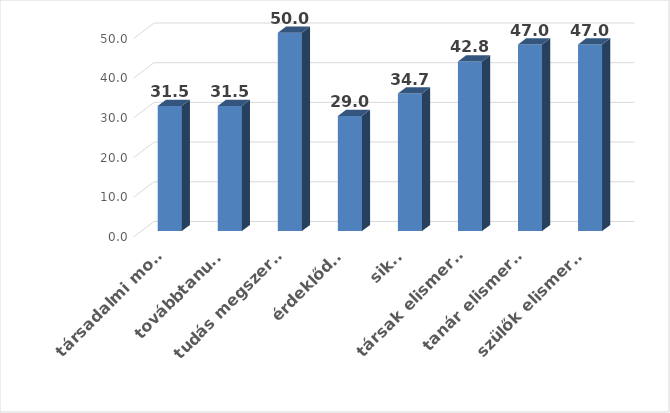
| Category | Series 0 |
|---|---|
| társadalmi motívumok, értékek | 31.5 |
| továbbtanulás | 31.5 |
| tudás megszerzése | 50 |
| érdeklődés | 29 |
| siker | 34.667 |
| társak elismerése | 42.75 |
| tanár elismerése | 47 |
| szülők elismerése | 47 |